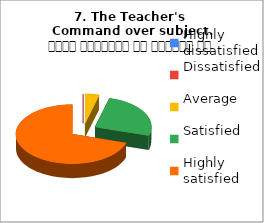
| Category | 7. The Teacher's 
Command over subject. विषय अवधारणा पर शिक्षक का ज्ञान |
|---|---|
| Highly dissatisfied | 0 |
| Dissatisfied | 0 |
| Average | 3 |
| Satisfied | 19 |
| Highly satisfied | 52 |